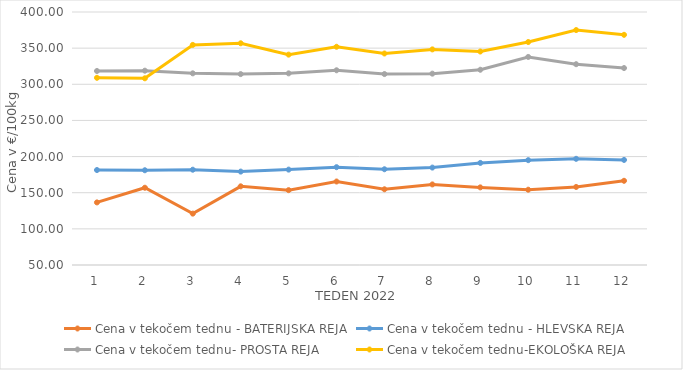
| Category | Cena v tekočem tednu - BATERIJSKA REJA | Cena v tekočem tednu - HLEVSKA REJA | Cena v tekočem tednu- PROSTA REJA | Cena v tekočem tednu-EKOLOŠKA REJA |
|---|---|---|---|---|
| 1.0 | 136.59 | 181.38 | 318.4 | 308.97 |
| 2.0 | 156.88 | 181.07 | 318.82 | 308.28 |
| 3.0 | 121.07 | 181.83 | 315.14 | 354.48 |
| 4.0 | 158.82 | 179.22 | 314.08 | 356.72 |
| 5.0 | 153.55 | 181.96 | 315.1 | 341.03 |
| 6.0 | 165.51 | 185.31 | 319.38 | 351.9 |
| 7.0 | 154.74 | 182.45 | 314.16 | 342.59 |
| 8.0 | 161.48 | 184.77 | 314.71 | 348.28 |
| 9.0 | 157.38 | 191.21 | 320.1 | 345.35 |
| 10.0 | 154.16 | 195.04 | 337.83 | 358.45 |
| 11.0 | 157.96 | 196.88 | 327.79 | 375 |
| 12.0 | 166.49 | 195.36 | 322.46 | 368.45 |